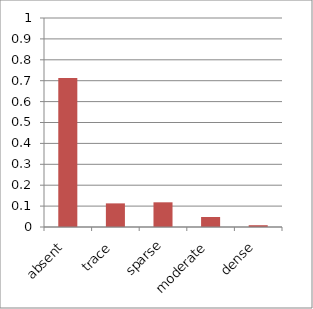
| Category | My het |
|---|---|
| absent | 0.712 |
| trace | 0.113 |
| sparse | 0.118 |
| moderate | 0.048 |
| dense | 0.009 |